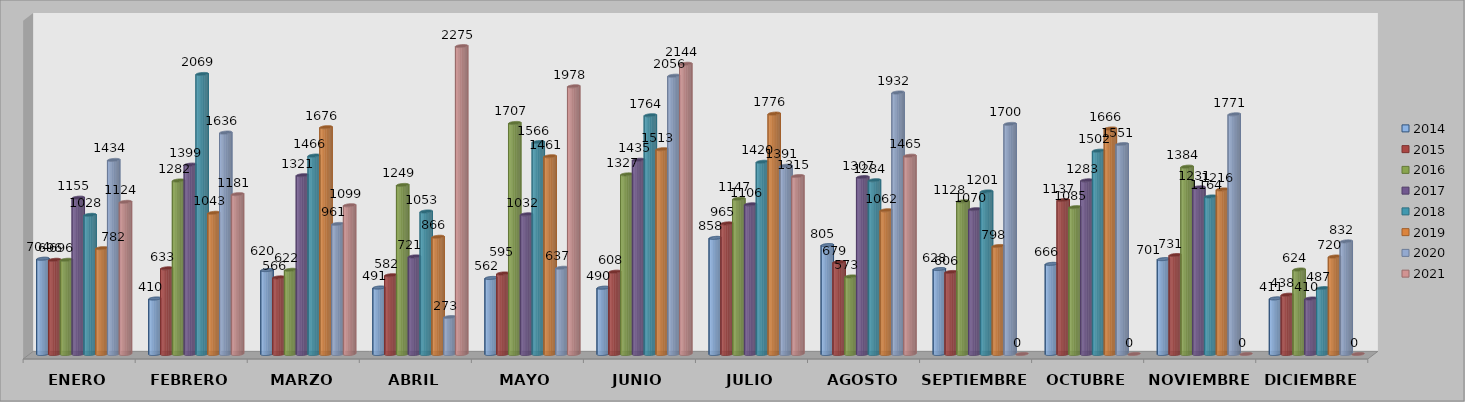
| Category | 2014 | 2015 | 2016 | 2017 | 2018 | 2019 | 2020 | 2021 |
|---|---|---|---|---|---|---|---|---|
| ENERO | 704 | 696 | 696 | 1155 | 1028 | 782 | 1434 | 1124 |
| FEBRERO | 410 | 633 | 1282 | 1399 | 2069 | 1043 | 1636 | 1181 |
| MARZO | 620 | 566 | 622 | 1321 | 1466 | 1676 | 961 | 1099 |
| ABRIL | 491 | 582 | 1249 | 721 | 1053 | 866 | 273 | 2275 |
| MAYO | 562 | 595 | 1707 | 1032 | 1566 | 1461 | 637 | 1978 |
| JUNIO | 490 | 608 | 1327 | 1435 | 1764 | 1513 | 2056 | 2144 |
| JULIO | 858 | 965 | 1147 | 1106 | 1420 | 1776 | 1391 | 1315 |
| AGOSTO | 805 | 679 | 573 | 1307 | 1284 | 1062 | 1932 | 1465 |
| SEPTIEMBRE | 628 | 606 | 1128 | 1070 | 1201 | 798 | 1700 | 0 |
| OCTUBRE | 666 | 1137 | 1085 | 1283 | 1502 | 1666 | 1551 | 0 |
| NOVIEMBRE | 701 | 731 | 1384 | 1231 | 1164 | 1216 | 1771 | 0 |
| DICIEMBRE | 411 | 438 | 624 | 410 | 487 | 720 | 832 | 0 |